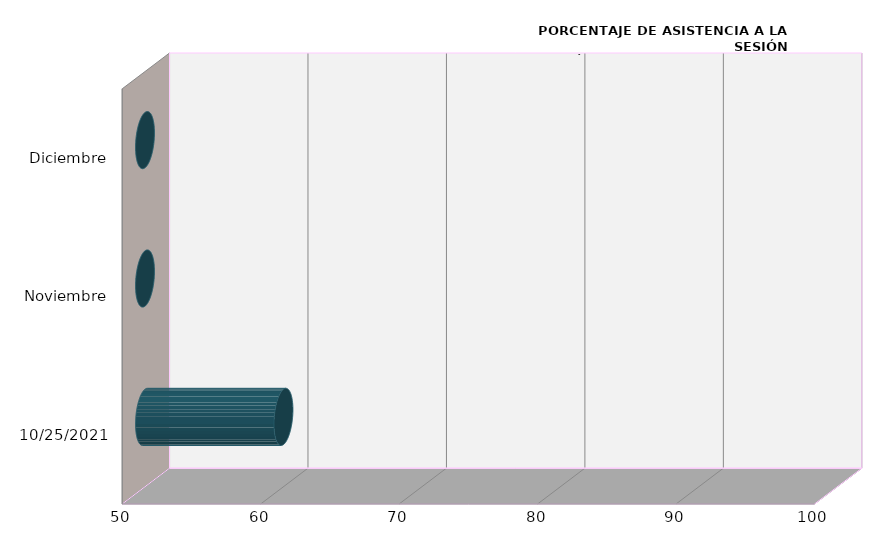
| Category | Series 0 |
|---|---|
| 25/10/2021 | 60 |
| Noviembre | 0 |
| Diciembre | 0 |